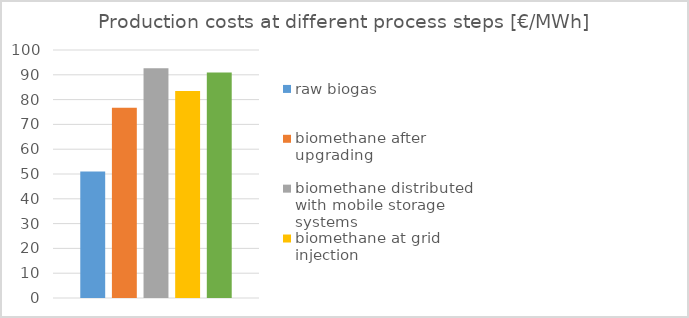
| Category | raw biogas | biomethane after upgrading | biomethane distributed with mobile storage systems | biomethane at grid injection | biomethane at fuel dispenser |
|---|---|---|---|---|---|
| 0 | 51.047 | 76.763 | 92.652 | 83.487 | 90.959 |